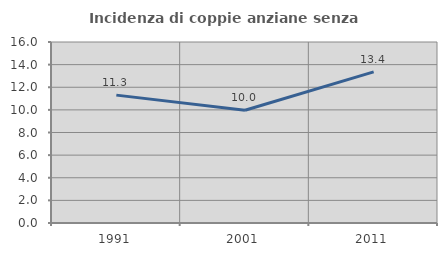
| Category | Incidenza di coppie anziane senza figli  |
|---|---|
| 1991.0 | 11.303 |
| 2001.0 | 9.966 |
| 2011.0 | 13.363 |